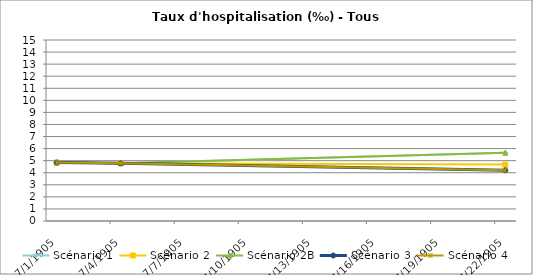
| Category | Scénario 1 | Scénario 2 | Scénario 2B | Scénario 3 | Scénario 4 |
|---|---|---|---|---|---|
| 2009.0 | 4.844 | 4.844 | 4.844 | 4.844 | 4.844 |
| 2012.0 | 4.784 | 4.784 | 4.784 | 4.784 | 4.784 |
| 2030.0 | 5.656 | 4.673 | 5.656 | 4.206 | 4.206 |